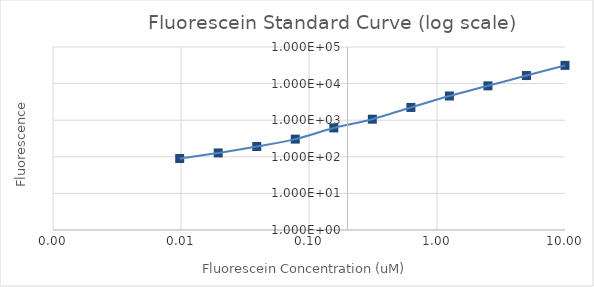
| Category | Series 1 |
|---|---|
| 10.0 | 31500.5 |
| 5.0 | 16595.25 |
| 2.5 | 8685.75 |
| 1.25 | 4586 |
| 0.625 | 2231.25 |
| 0.3125 | 1065 |
| 0.15625 | 615.5 |
| 0.078125 | 304.25 |
| 0.0390625 | 191.25 |
| 0.01953125 | 127.5 |
| 0.009765625 | 89.75 |